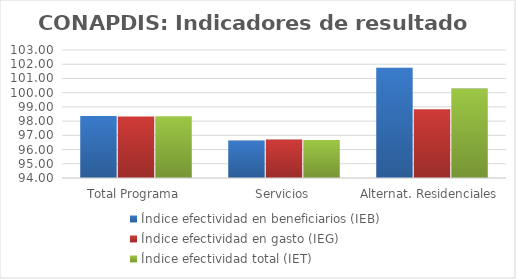
| Category | Índice efectividad en beneficiarios (IEB) | Índice efectividad en gasto (IEG)  | Índice efectividad total (IET) |
|---|---|---|---|
| Total Programa | 98.355 | 98.331 | 98.343 |
| Servicios | 96.634 | 96.698 | 96.666 |
| Alternat. Residenciales | 101.744 | 98.83 | 100.287 |